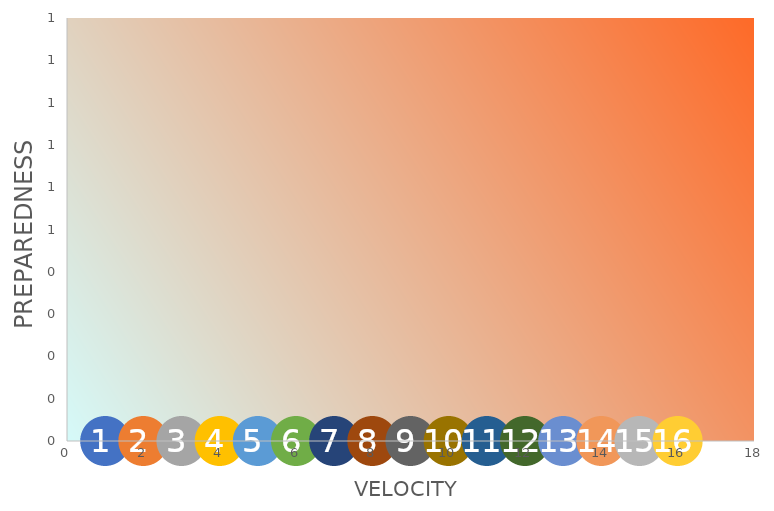
| Category | Series 0 |
|---|---|
| 0.0 | 0 |
| 0.0 | 0 |
| 0.0 | 0 |
| 0.0 | 0 |
| 0.0 | 0 |
| 0.0 | 0 |
| 0.0 | 0 |
| 0.0 | 0 |
| 0.0 | 0 |
| 0.0 | 0 |
| 0.0 | 0 |
| 0.0 | 0 |
| 0.0 | 0 |
| 0.0 | 0 |
| 0.0 | 0 |
| 0.0 | 0 |